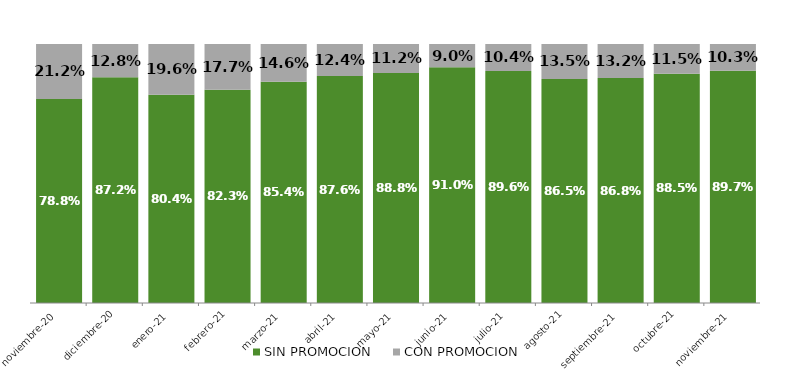
| Category | SIN PROMOCION   | CON PROMOCION   |
|---|---|---|
| 2020-11-01 | 0.788 | 0.212 |
| 2020-12-01 | 0.872 | 0.128 |
| 2021-01-01 | 0.804 | 0.196 |
| 2021-02-01 | 0.823 | 0.177 |
| 2021-03-01 | 0.854 | 0.146 |
| 2021-04-01 | 0.876 | 0.124 |
| 2021-05-01 | 0.888 | 0.112 |
| 2021-06-01 | 0.91 | 0.09 |
| 2021-07-01 | 0.896 | 0.104 |
| 2021-08-01 | 0.865 | 0.135 |
| 2021-09-01 | 0.868 | 0.132 |
| 2021-10-01 | 0.885 | 0.115 |
| 2021-11-01 | 0.897 | 0.103 |